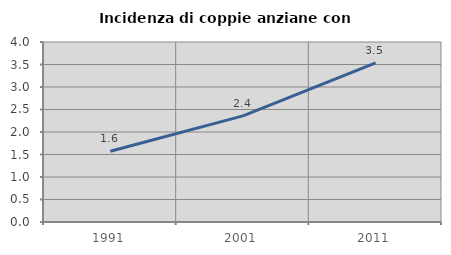
| Category | Incidenza di coppie anziane con figli |
|---|---|
| 1991.0 | 1.573 |
| 2001.0 | 2.359 |
| 2011.0 | 3.538 |